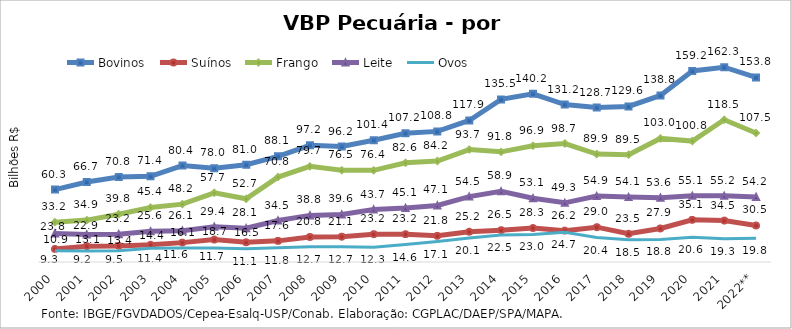
| Category | Bovinos | Suínos | Frango | Leite | Ovos |
|---|---|---|---|---|---|
| 2000 | 60.349 | 10.927 | 33.208 | 23.837 | 9.32 |
| 2001 | 66.71 | 13.11 | 34.904 | 22.938 | 9.184 |
| 2002 | 70.792 | 13.436 | 39.841 | 23.227 | 9.462 |
| 2003 | 71.448 | 14.36 | 45.422 | 25.578 | 11.446 |
| 2004 | 80.387 | 16.145 | 48.233 | 26.142 | 11.601 |
| 2005 | 78.045 | 18.719 | 57.665 | 29.402 | 11.679 |
| 2006 | 81.03 | 16.466 | 52.68 | 28.084 | 11.094 |
| 2007 | 88.06 | 17.607 | 70.78 | 34.525 | 11.791 |
| 2008 | 97.229 | 20.848 | 79.676 | 38.839 | 12.734 |
| 2009 | 96.215 | 21.075 | 76.5 | 39.596 | 12.697 |
| 2010 | 101.44 | 23.184 | 76.407 | 43.729 | 12.349 |
| 2011 | 107.237 | 23.22 | 82.638 | 45.079 | 14.551 |
| 2012 | 108.836 | 21.803 | 84.181 | 47.106 | 17.058 |
| 2013 | 117.94 | 25.244 | 93.694 | 54.511 | 20.062 |
| 2014 | 135.491 | 26.515 | 91.799 | 58.864 | 22.54 |
| 2015 | 140.154 | 28.336 | 96.911 | 53.135 | 22.951 |
| 2016 | 131.191 | 26.15 | 98.746 | 49.303 | 24.742 |
| 2017 | 128.741 | 29.029 | 89.94 | 54.934 | 20.394 |
| 2018 | 129.604 | 23.51 | 89.45 | 54.118 | 18.545 |
| 2019 | 138.777 | 27.944 | 102.993 | 53.616 | 18.782 |
| 2020 | 159.186 | 35.125 | 100.765 | 55.125 | 20.626 |
| 2021 | 162.328 | 34.499 | 118.539 | 55.186 | 19.329 |
| 2022** | 153.796 | 30.453 | 107.5 | 54.181 | 19.78 |